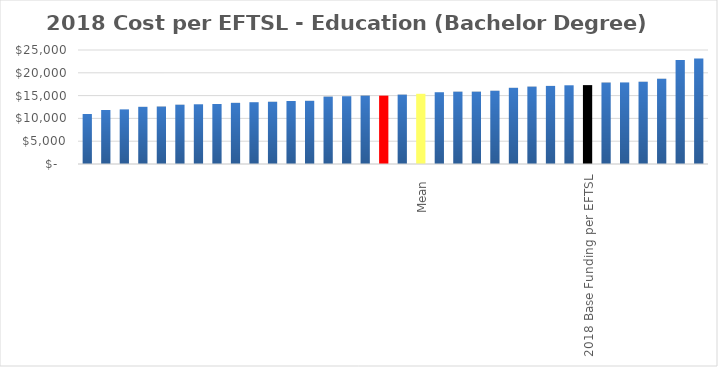
| Category | Series 0 |
|---|---|
|  | 10960.223 |
|  | 11845.101 |
|  | 11977.265 |
|  | 12538.425 |
|  | 12596.748 |
|  | 13000.964 |
|  | 13097.117 |
|  | 13160.944 |
|  | 13412.25 |
|  | 13550.684 |
|  | 13649.253 |
|  | 13811.77 |
|  | 13858.256 |
|  | 14775.464 |
|  | 14860.317 |
|  | 14991.418 |
| Median | 14991.418 |
|  | 15213.656 |
| Mean  | 15396.938 |
|  | 15737.288 |
|  | 15861.176 |
|  | 15863.834 |
|  | 16066.229 |
|  | 16708.519 |
|  | 16968.616 |
|  | 17125.511 |
|  | 17261.871 |
| 2018 Base Funding per EFTSL | 17299 |